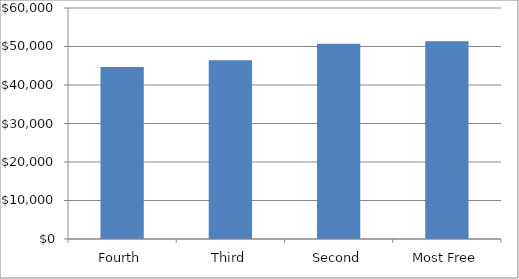
| Category | Series 0 |
|---|---|
| Fourth | 44645.066 |
| Third | 46418.314 |
| Second | 50726.749 |
| Most Free | 51333.642 |